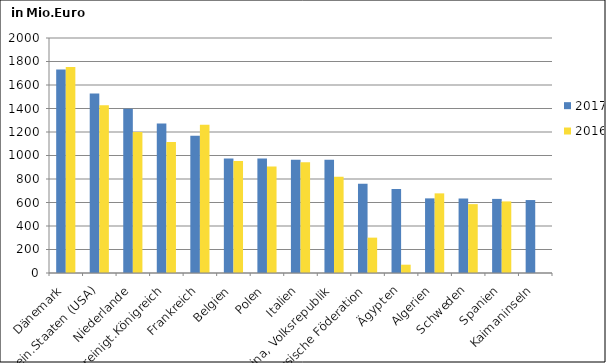
| Category | 2017 | 2016 |
|---|---|---|
| Dänemark | 1730.942 | 1752.868 |
| Verein.Staaten (USA) | 1526.78 | 1428.468 |
| Niederlande | 1398.534 | 1200.548 |
| Vereinigt.Königreich | 1272.567 | 1114.834 |
| Frankreich | 1167.847 | 1261.266 |
| Belgien | 974.138 | 953.079 |
| Polen | 973.748 | 906.124 |
| Italien | 964.798 | 941.564 |
| China, Volksrepublik | 964.71 | 818.817 |
| Russische Föderation | 759.265 | 300.915 |
| Ägypten | 714.785 | 70.625 |
| Algerien | 635.16 | 677.741 |
| Schweden | 633.967 | 586.156 |
| Spanien | 630.722 | 609.177 |
| Kaimaninseln | 620.846 | 0.204 |